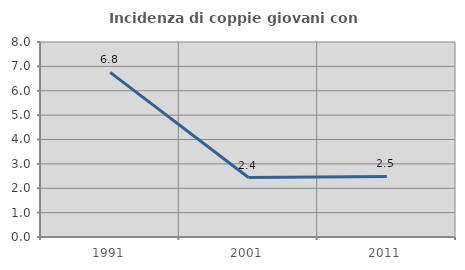
| Category | Incidenza di coppie giovani con figli |
|---|---|
| 1991.0 | 6.755 |
| 2001.0 | 2.439 |
| 2011.0 | 2.482 |